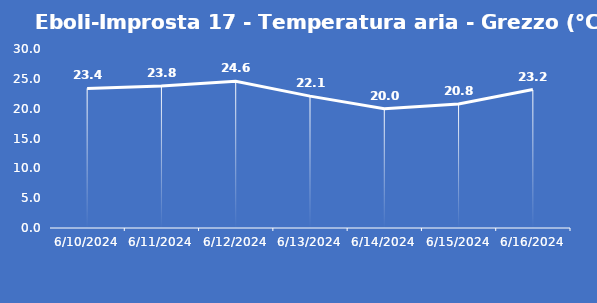
| Category | Eboli-Improsta 17 - Temperatura aria - Grezzo (°C) |
|---|---|
| 6/10/24 | 23.4 |
| 6/11/24 | 23.8 |
| 6/12/24 | 24.6 |
| 6/13/24 | 22.1 |
| 6/14/24 | 20 |
| 6/15/24 | 20.8 |
| 6/16/24 | 23.2 |